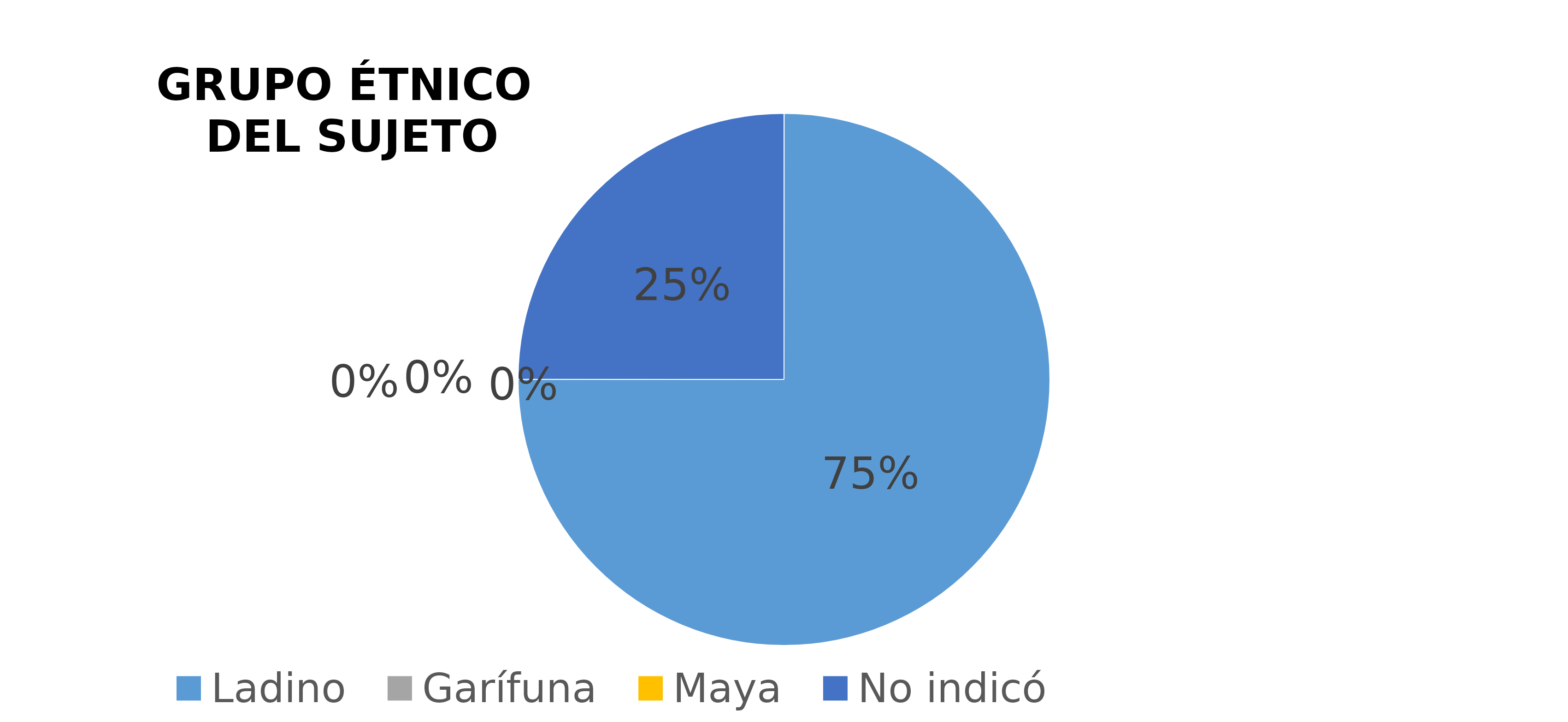
| Category | Series 0 |
|---|---|
| Ladino | 3 |
| Xinca | 0 |
| Garífuna | 0 |
| Maya | 0 |
| No indicó | 1 |